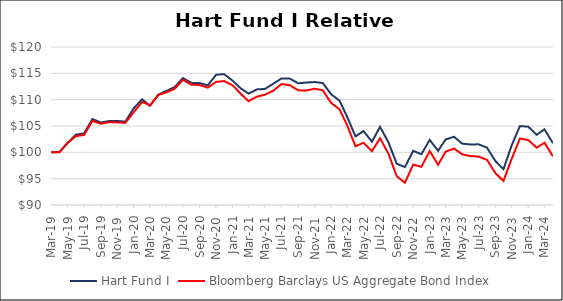
| Category | Hart Fund I | Bloomberg Barclays US Aggregate Bond Index |
|---|---|---|
| 2019-03-01 | 100 | 100 |
| 2019-04-01 | 100.074 | 100.026 |
| 2019-05-01 | 101.775 | 101.801 |
| 2019-06-01 | 103.353 | 103.08 |
| 2019-07-01 | 103.596 | 103.306 |
| 2019-08-01 | 106.315 | 105.983 |
| 2019-09-01 | 105.664 | 105.419 |
| 2019-10-01 | 105.934 | 105.737 |
| 2019-11-01 | 105.948 | 105.682 |
| 2019-12-01 | 105.836 | 105.609 |
| 2020-01-01 | 108.39 | 107.641 |
| 2020-02-01 | 110.06 | 109.579 |
| 2020-03-01 | 108.831 | 108.934 |
| 2020-04-01 | 110.956 | 110.87 |
| 2020-05-01 | 111.659 | 111.386 |
| 2020-06-01 | 112.412 | 112.088 |
| 2020-07-01 | 114.101 | 113.762 |
| 2020-08-01 | 113.193 | 112.844 |
| 2020-09-01 | 113.14 | 112.782 |
| 2020-10-01 | 112.718 | 112.279 |
| 2020-11-01 | 114.738 | 113.38 |
| 2020-12-01 | 114.841 | 113.536 |
| 2021-01-01 | 113.603 | 112.722 |
| 2021-02-01 | 112.109 | 111.095 |
| 2021-03-01 | 111.157 | 109.707 |
| 2021-04-01 | 111.949 | 110.574 |
| 2021-05-01 | 112.041 | 110.935 |
| 2021-06-01 | 113.029 | 111.715 |
| 2021-07-01 | 114.038 | 112.964 |
| 2021-08-01 | 113.994 | 112.749 |
| 2021-09-01 | 113.108 | 111.773 |
| 2021-10-01 | 113.255 | 111.742 |
| 2021-11-01 | 113.349 | 112.073 |
| 2021-12-01 | 113.151 | 111.786 |
| 2022-01-01 | 111.022 | 109.378 |
| 2022-02-01 | 109.811 | 108.157 |
| 2022-03-01 | 106.766 | 105.152 |
| 2022-04-01 | 103.035 | 101.162 |
| 2022-05-01 | 104.025 | 101.814 |
| 2022-06-01 | 102.018 | 100.217 |
| 2022-07-01 | 104.843 | 102.666 |
| 2022-08-01 | 101.899 | 99.765 |
| 2022-09-01 | 97.832 | 95.454 |
| 2022-10-01 | 97.207 | 94.218 |
| 2022-11-01 | 100.283 | 97.683 |
| 2022-12-01 | 99.638 | 97.242 |
| 2023-01-01 | 102.36 | 100.234 |
| 2023-02-01 | 100.295 | 97.642 |
| 2023-03-01 | 102.441 | 100.122 |
| 2023-04-01 | 102.954 | 100.73 |
| 2023-05-01 | 101.648 | 99.633 |
| 2023-06-01 | 101.501 | 99.277 |
| 2023-07-01 | 101.516 | 99.208 |
| 2023-08-01 | 100.895 | 98.575 |
| 2023-09-01 | 98.361 | 96.069 |
| 2023-10-01 | 96.791 | 94.553 |
| 2023-11-01 | 101.395 | 98.835 |
| 2023-12-01 | 104.985 | 102.619 |
| 2024-01-01 | 104.87 | 102.337 |
| 2024-02-01 | 103.333 | 100.891 |
| 2024-03-01 | 104.374 | 101.823 |
| 2024-04-01 | 101.748 | 99.251 |